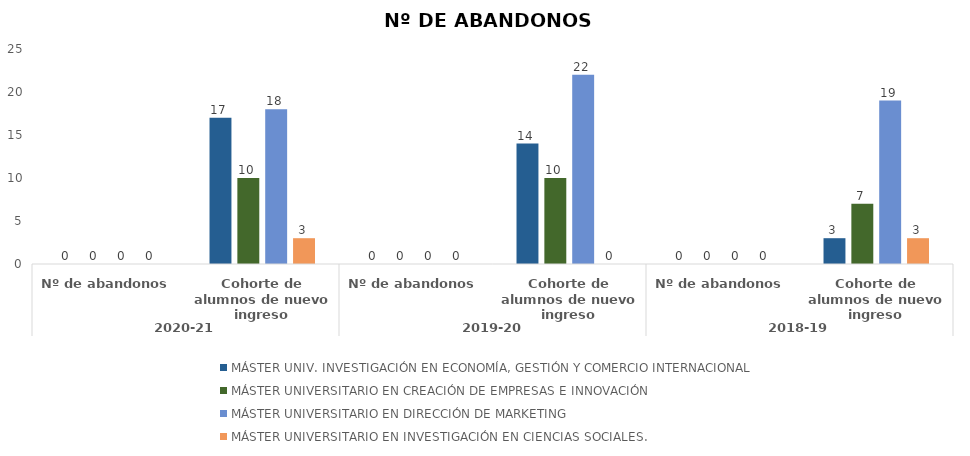
| Category | Grado | Facultad de Ciencias Económicas y Empresariales | Máster | MÁSTER UNIV. INVESTIGACIÓN EN ECONOMÍA, GESTIÓN Y COMERCIO INTERNACIONAL | MÁSTER UNIVERSITARIO EN CREACIÓN DE EMPRESAS E INNOVACIÓN | MÁSTER UNIVERSITARIO EN DIRECCIÓN DE MARKETING | MÁSTER UNIVERSITARIO EN INVESTIGACIÓN EN CIENCIAS SOCIALES. |
|---|---|---|---|---|---|---|---|
| 0 |  |  |  | 0 | 0 | 0 | 0 |
| 1 |  |  |  | 17 | 10 | 18 | 3 |
| 2 |  |  |  | 0 | 0 | 0 | 0 |
| 3 |  |  |  | 14 | 10 | 22 | 0 |
| 4 |  |  |  | 0 | 0 | 0 | 0 |
| 5 |  |  |  | 3 | 7 | 19 | 3 |